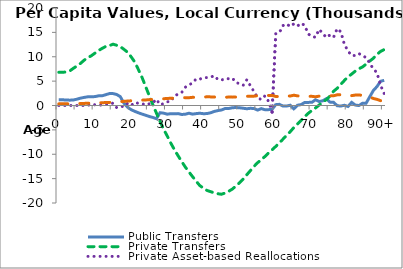
| Category | Public Transfers | Private Transfers | Private Asset-based Reallocations | Public Asset-based Reallocations |
|---|---|---|---|---|
| 0 | 1189.853 | 6809.11 | -0.078 | 345.006 |
|  | 1163.678 | 6833.465 | 0.133 | 346.235 |
| 2 | 1137.503 | 6858.163 | 0 | 347.464 |
| 3 | 1094.362 | 7078.091 | -0.113 | 352.702 |
| 4 | 1126.558 | 7612.123 | -0.102 | 365.682 |
| 5 | 1294.203 | 8099.469 | -0.14 | 380.921 |
| 6 | 1508.182 | 8634.505 | -0.275 | 401.651 |
| 7 | 1658.171 | 9293.089 | -1.702 | 429.796 |
| 8 | 1779.068 | 9805.581 | -3.42 | 454.674 |
| 9 | 1794.578 | 10212.122 | 312.02 | 482.351 |
| 10 | 1826.997 | 10742.36 | 135.182 | 511.35 |
| 11 | 1979.42 | 11278.231 | 82.79 | 541.865 |
| 12 | 2000.362 | 11723.032 | 84.909 | 573.815 |
| 13 | 2216.458 | 12119.36 | 142.385 | 606.437 |
| 14 | 2450.217 | 12281.028 | 326.817 | 637.829 |
| 15 | 2441.094 | 12576.852 | 471.096 | 681.137 |
| 16 | 2267.452 | 12357.47 | -428.224 | 732.465 |
| 17 | 1820.825 | 12085.06 | -185.088 | 791.686 |
| 18 | 485.291 | 11524.856 | -211.452 | 850.481 |
| 19 | -335.389 | 10946.301 | 414.178 | 911.601 |
| 20 | -851.231 | 9993.423 | -14.033 | 965.338 |
| 21 | -1193.106 | 8923.996 | 632.602 | 1015.879 |
| 22 | -1488.379 | 7398.776 | 443.59 | 1066.044 |
| 23 | -1759.492 | 5792.376 | 393.488 | 1102.124 |
| 24 | -1994.622 | 3926.76 | 107.644 | 1138.982 |
| 25 | -2248.988 | 2041.503 | 340.244 | 1196.203 |
| 26 | -2447.976 | 204.373 | 541.444 | 1242.997 |
| 27 | -2698.452 | -1560.131 | 1287.701 | 1306.703 |
| 28 | -1478.262 | -3265.119 | 160.805 | 1332.416 |
| 29 | -1572.374 | -4884.848 | 375.234 | 1384.96 |
| 30 | -1781.996 | -6263.854 | 754.954 | 1458.465 |
| 31 | -1672.816 | -7749.31 | 860.661 | 1465.263 |
| 32 | -1677.035 | -9088.246 | 1992.915 | 1500.185 |
| 33 | -1665.977 | -10324.411 | 2328.133 | 1524.481 |
| 34 | -1838.478 | -11504.079 | 2678.436 | 1589.595 |
| 35 | -1786.83 | -12639.998 | 3752.27 | 1611.278 |
| 36 | -1583.844 | -13633.425 | 4242.074 | 1597.563 |
| 37 | -1774.062 | -14605.781 | 4627.531 | 1674.254 |
| 38 | -1663.126 | -15539.561 | 5463.801 | 1682.715 |
| 39 | -1585.568 | -16427.525 | 5403.819 | 1696.755 |
| 40 | -1684.534 | -16947.804 | 5700.583 | 1749.493 |
| 41 | -1654.997 | -17422.332 | 5733.661 | 1775.13 |
| 42 | -1490.348 | -17680.122 | 5815.231 | 1768.204 |
| 43 | -1217.191 | -17906.961 | 6110.429 | 1739.286 |
| 44 | -1046.643 | -18102.241 | 5333.401 | 1724.791 |
| 45 | -920.359 | -18201.764 | 5211.928 | 1725.778 |
| 46 | -617.246 | -17955.338 | 5553.944 | 1691.477 |
| 47 | -622.85 | -17590.348 | 5483.105 | 1730.295 |
| 48 | -460.565 | -17145.783 | 5622.175 | 1716.538 |
| 49 | -412.976 | -16506.731 | 4676.206 | 1734.208 |
| 50 | -466.137 | -15843.915 | 4505.258 | 1776.823 |
| 51 | -558.288 | -15088.791 | 4146.781 | 1832.24 |
| 52 | -670.874 | -14199.837 | 5282.466 | 1898.627 |
| 53 | -574.927 | -13352.257 | 4044.237 | 1895.127 |
| 54 | -627.071 | -12482.562 | 2841.291 | 1916.656 |
| 55 | -941.397 | -11731.556 | 1584.805 | 2009.308 |
| 56 | -637.911 | -11118.915 | 1217.757 | 1961.763 |
| 57 | -861.359 | -10471.534 | 1971.245 | 2053.757 |
| 58 | -849.735 | -9742.373 | 886.317 | 2062.907 |
| 59 | -792.1 | -9088.9 | -1346.081 | 2066.229 |
| 60 | 174.15 | -8397.438 | 14713.433 | 1851.731 |
| 61 | 242.253 | -7653.544 | 14915.08 | 1849.225 |
| 62 | -118.315 | -6906.011 | 16394.833 | 1955.627 |
| 63 | -115.128 | -6144.031 | 16743.794 | 1966.776 |
| 64 | 54.17 | -5377.49 | 16195.7 | 1940.493 |
| 65 | -681.915 | -4537.058 | 16737.593 | 2112.495 |
| 66 | 47.606 | -3812.021 | 16288.574 | 1974.251 |
| 67 | 183.89 | -3092.892 | 16886.908 | 1968.705 |
| 68 | 612.288 | -2293.897 | 16435.551 | 1885.752 |
| 69 | 638.35 | -1597.211 | 14681.17 | 1875.87 |
| 70 | 650.011 | -1014.729 | 14134.954 | 1880.703 |
| 71 | 1180.675 | -508.481 | 14006.634 | 1788.242 |
| 72 | 814.085 | 87.151 | 15616.739 | 1911.757 |
| 73 | 966.217 | 673.841 | 14778.393 | 1885.128 |
| 74 | 1399.181 | 1208.999 | 13948.797 | 1800.345 |
| 75 | 693.594 | 1924.304 | 14462.809 | 1972.744 |
| 76 | 652.669 | 2922.268 | 14006.634 | 1995.602 |
| 77 | -44.669 | 3529.905 | 15771.593 | 2187.998 |
| 78 | -113.033 | 4345.884 | 15106.958 | 2207.625 |
| 79 | 52.461 | 5141.483 | 12531.401 | 2160.433 |
| 80 | -201.894 | 5884.26 | 11171.616 | 2209.611 |
| 81 | 640.072 | 6450.407 | 10223.793 | 2021.993 |
| 82 | 90.891 | 7044.735 | 10268.7 | 2142.61 |
| 83 | -13.576 | 7532.788 | 10663.633 | 2169.914 |
| 84 | 456.549 | 7900.307 | 10201.187 | 2060.752 |
| 85 | 475.238 | 8494.724 | 9847.835 | 2056.524 |
| 86 | 1775.968 | 9112.065 | 8714.672 | 1755.915 |
| 87 | 3069.901 | 9683.039 | 7479.601 | 1439.34 |
| 88 | 3882.909 | 10459.787 | 6747.637 | 1259.49 |
| 89 | 4961.993 | 11101.466 | 4131.128 | 996.877 |
| 90+ | 5163.993 | 11475.865 | 2464.49 | 930.308 |